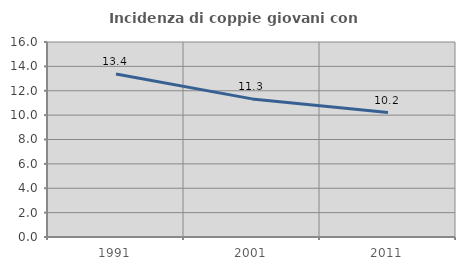
| Category | Incidenza di coppie giovani con figli |
|---|---|
| 1991.0 | 13.37 |
| 2001.0 | 11.331 |
| 2011.0 | 10.215 |